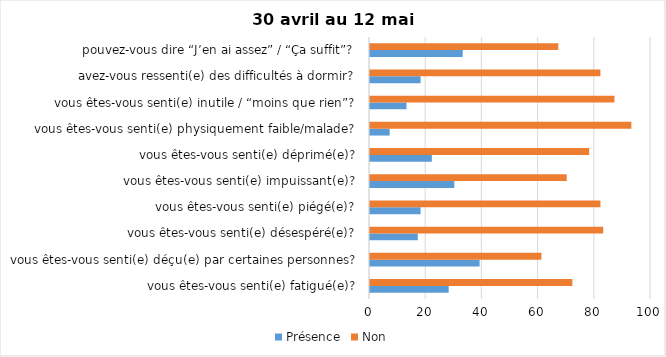
| Category | Présence | Non |
|---|---|---|
| vous êtes-vous senti(e) fatigué(e)? | 28 | 72 |
| vous êtes-vous senti(e) déçu(e) par certaines personnes? | 39 | 61 |
| vous êtes-vous senti(e) désespéré(e)? | 17 | 83 |
| vous êtes-vous senti(e) piégé(e)? | 18 | 82 |
| vous êtes-vous senti(e) impuissant(e)? | 30 | 70 |
| vous êtes-vous senti(e) déprimé(e)? | 22 | 78 |
| vous êtes-vous senti(e) physiquement faible/malade? | 7 | 93 |
| vous êtes-vous senti(e) inutile / “moins que rien”? | 13 | 87 |
| avez-vous ressenti(e) des difficultés à dormir? | 18 | 82 |
| pouvez-vous dire “J’en ai assez” / “Ça suffit”? | 33 | 67 |